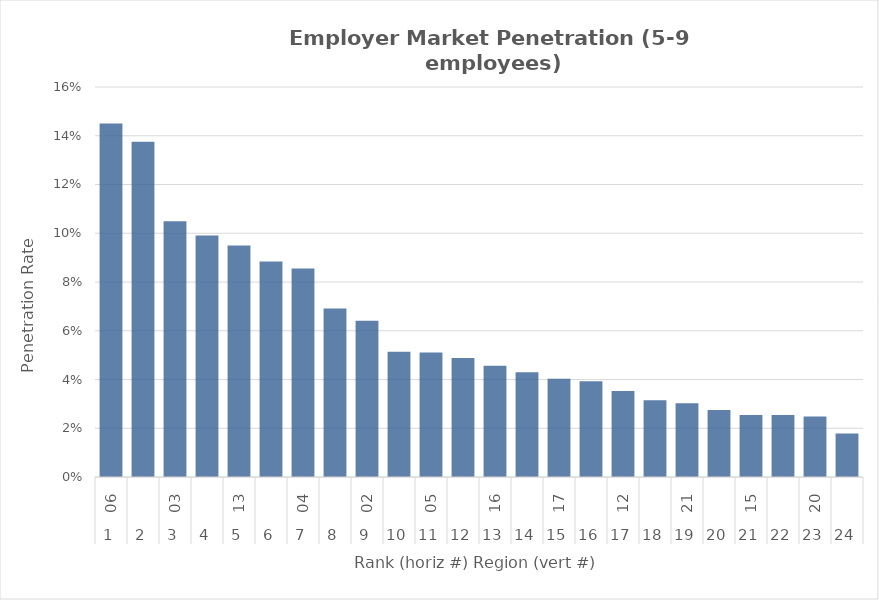
| Category | Rate |
|---|---|
| 0 | 0.145 |
| 1 | 0.138 |
| 2 | 0.105 |
| 3 | 0.099 |
| 4 | 0.095 |
| 5 | 0.088 |
| 6 | 0.086 |
| 7 | 0.069 |
| 8 | 0.064 |
| 9 | 0.051 |
| 10 | 0.051 |
| 11 | 0.049 |
| 12 | 0.046 |
| 13 | 0.043 |
| 14 | 0.04 |
| 15 | 0.039 |
| 16 | 0.035 |
| 17 | 0.031 |
| 18 | 0.03 |
| 19 | 0.028 |
| 20 | 0.025 |
| 21 | 0.025 |
| 22 | 0.025 |
| 23 | 0.018 |